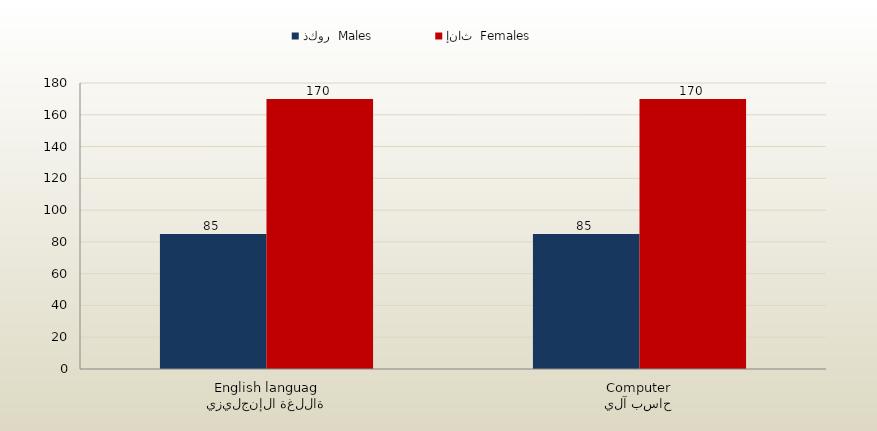
| Category | ذكور  Males | إناث  Females |
|---|---|---|
| اللغة الإنجليزية
English language | 85 | 170 |
| حاسب آلي
Computer | 85 | 170 |